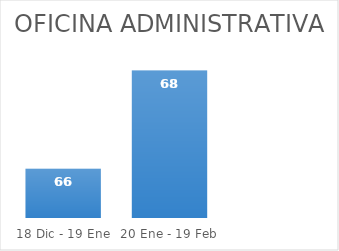
| Category | Series 0 |
|---|---|
| 18 Dic - 19 Ene | 66 |
| 20 Ene - 19 Feb | 68 |